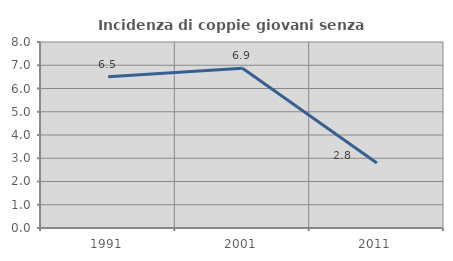
| Category | Incidenza di coppie giovani senza figli |
|---|---|
| 1991.0 | 6.509 |
| 2001.0 | 6.875 |
| 2011.0 | 2.797 |